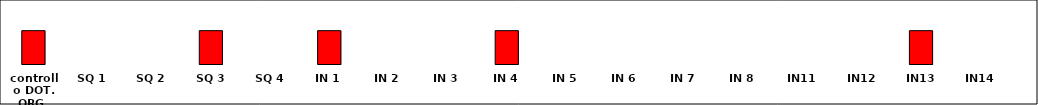
| Category | Series 0 |
|---|---|
| controllo DOT. ORG. | 1 |
| SQ 1 | 0 |
| SQ 2 | 0 |
| SQ 3 | 1 |
| SQ 4 | 0 |
| IN 1 | 1 |
| IN 2 | 0 |
| IN 3 | 0 |
| IN 4 | 1 |
| IN 5 | 0 |
| IN 6 | 0 |
| IN 7 | 0 |
| IN 8 | 0 |
| IN11 | 0 |
| IN12 | 0 |
| IN13 | 1 |
| IN14 | 0 |